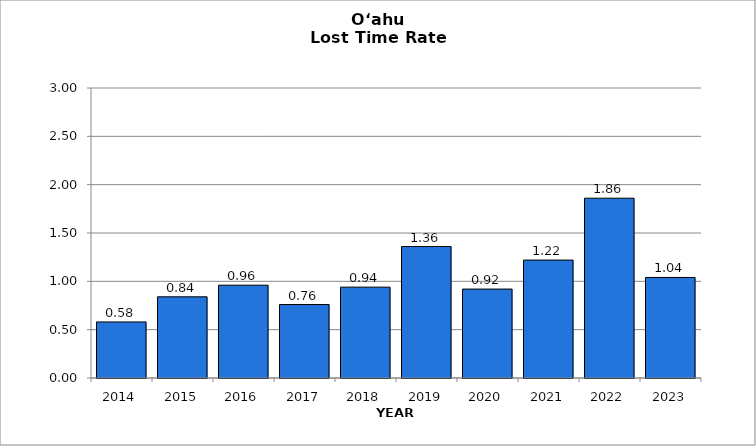
| Category | O‘ahu |
|---|---|
| 2014.0 | 0.58 |
| 2015.0 | 0.84 |
| 2016.0 | 0.96 |
| 2017.0 | 0.76 |
| 2018.0 | 0.94 |
| 2019.0 | 1.36 |
| 2020.0 | 0.92 |
| 2021.0 | 1.22 |
| 2022.0 | 1.86 |
| 2023.0 | 1.04 |